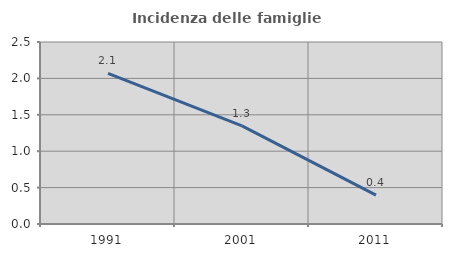
| Category | Incidenza delle famiglie numerose |
|---|---|
| 1991.0 | 2.069 |
| 2001.0 | 1.348 |
| 2011.0 | 0.397 |